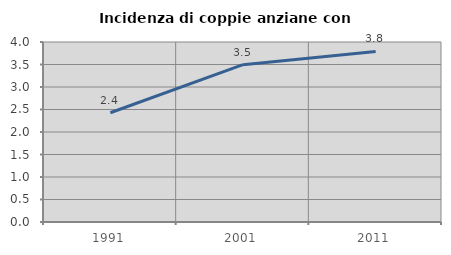
| Category | Incidenza di coppie anziane con figli |
|---|---|
| 1991.0 | 2.429 |
| 2001.0 | 3.496 |
| 2011.0 | 3.789 |